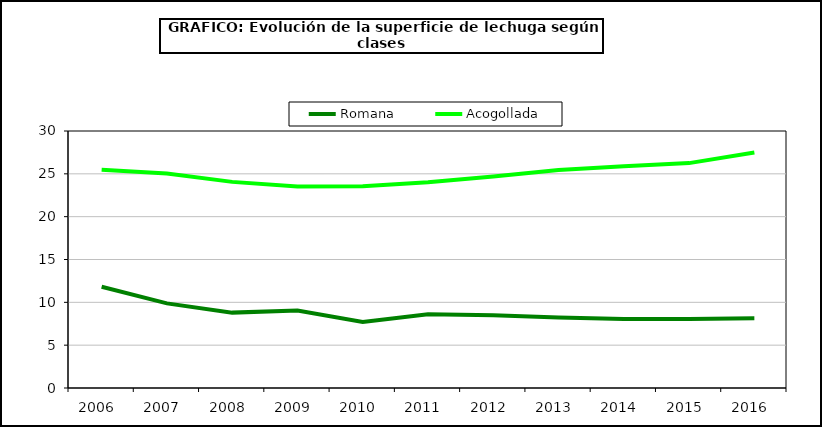
| Category | Romana | Acogollada |
|---|---|---|
| 2006.0 | 11.817 | 25.482 |
| 2007.0 | 9.88 | 25.033 |
| 2008.0 | 8.799 | 24.061 |
| 2009.0 | 9.045 | 23.512 |
| 2010.0 | 7.707 | 23.549 |
| 2011.0 | 8.605 | 24.015 |
| 2012.0 | 8.497 | 24.699 |
| 2013.0 | 8.23 | 25.438 |
| 2014.0 | 8.041 | 25.883 |
| 2015.0 | 8.063 | 26.251 |
| 2016.0 | 8.145 | 27.501 |